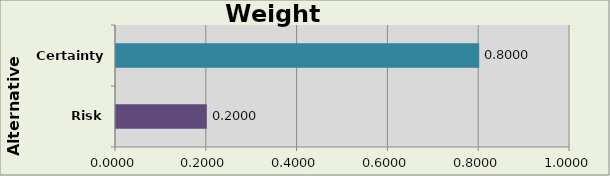
| Category | Risk Costs Certainty |
|---|---|
| Risk Costs | 0.2 |
| Certainty | 0.8 |